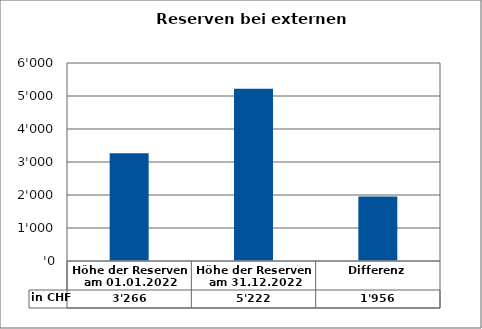
| Category | in CHF |
|---|---|
| Höhe der Reserven am 01.01.2022 | 3266 |
| Höhe der Reserven am 31.12.2022 | 5221.96 |
| Differenz | 1955.96 |